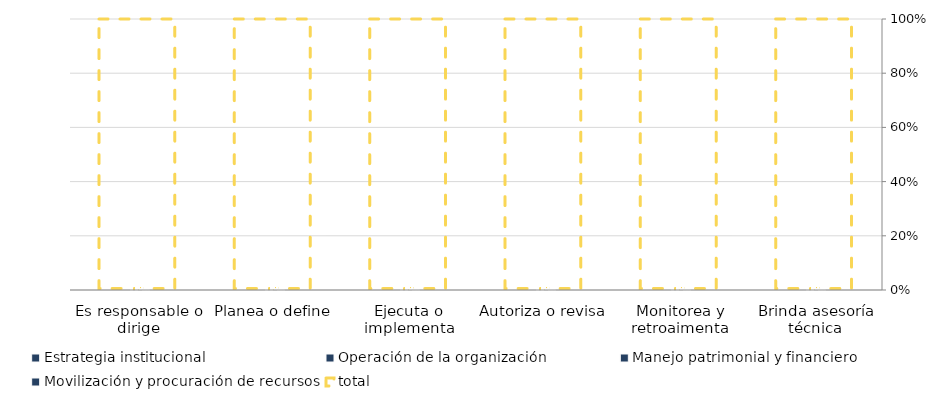
| Category | Estrategia institucional | Operación de la organización | Manejo patrimonial y financiero | Movilización y procuración de recursos |
|---|---|---|---|---|
| Es responsable o dirige | 0 | 0 | 0 | 0 |
| Planea o define | 0 | 0 | 0 | 0 |
| Ejecuta o implementa | 0 | 0 | 0 | 0 |
| Autoriza o revisa | 0 | 0 | 0 | 0 |
| Monitorea y retroaimenta | 0 | 0 | 0 | 0 |
| Brinda asesoría técnica | 0 | 0 | 0 | 0 |